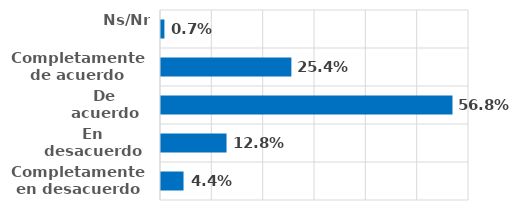
| Category | Series 0 |
|---|---|
| Completamente en desacuerdo | 0.044 |
| En desacuerdo | 0.128 |
| De acuerdo | 0.568 |
| Completamente de acuerdo | 0.254 |
| Ns/Nr | 0.007 |